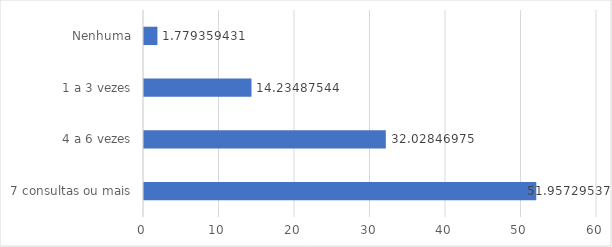
| Category | Series 0 |
|---|---|
| 7 consultas ou mais | 51.957 |
| 4 a 6 vezes | 32.028 |
| 1 a 3 vezes | 14.235 |
| Nenhuma | 1.779 |